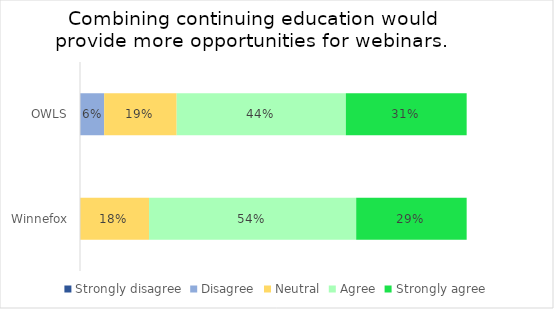
| Category | Strongly disagree | Disagree | Neutral | Agree | Strongly agree |
|---|---|---|---|---|---|
| OWLS | 0 | 0.062 | 0.188 | 0.438 | 0.312 |
| Winnefox | 0 | 0 | 0.179 | 0.536 | 0.286 |